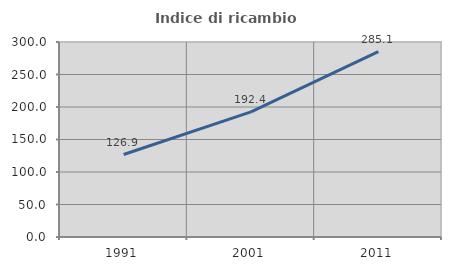
| Category | Indice di ricambio occupazionale  |
|---|---|
| 1991.0 | 126.919 |
| 2001.0 | 192.4 |
| 2011.0 | 285.113 |